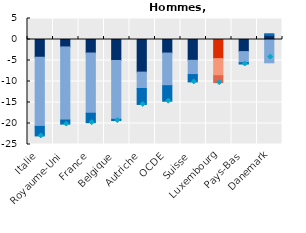
| Category | Heures par salarié en emploi | Emploi sans heures travaillées | Chômage (net de l'évolution démographique) |
|---|---|---|---|
| Italie | -4.226 | -16.46 | -2.274 |
| Royaume-Uni | -1.77 | -17.406 | -0.972 |
| France | -3.219 | -14.33 | -2.248 |
| Belgique | -4.992 | -14.014 | -0.289 |
| Autriche | -7.768 | -3.902 | -3.79 |
| OCDE | -3.231 | -7.772 | -3.69 |
| Suisse | -4.955 | -3.393 | -1.753 |
| Luxembourg | -4.551 | -4.064 | -1.657 |
| Pays-Bas | -2.879 | -2.631 | -0.325 |
| Danemark | 0.953 | -5.547 | 0.407 |